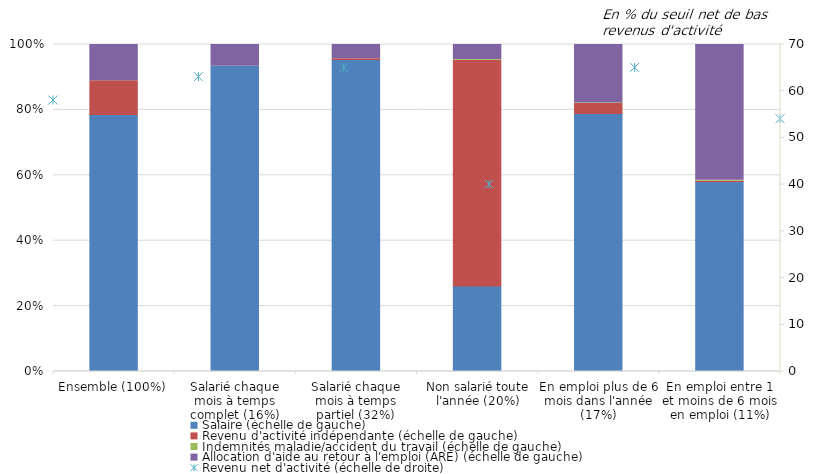
| Category | Salaire (échelle de gauche) | Revenu d'activité indépendante (échelle de gauche) | Indemnités maladie/accident du travail (échelle de gauche) | Allocation d'aide au retour à l'emploi (ARE) (échelle de gauche) |
|---|---|---|---|---|
| Ensemble (100%) | 504 | 66 | 0 | 71 |
| Salarié chaque mois à temps complet (16%) | 642 | 0 | 0 | 46 |
| Salarié chaque mois à temps partiel (32%) | 683 | 2 | 0 | 31 |
| Non salarié toute l'année (20%) | 114 | 301 | 1 | 20 |
| En emploi plus de 6 mois dans l'année (17%) | 564 | 22 | 1 | 128 |
| En emploi entre 1 et moins de 6 mois en emploi (11%) | 347 | 1 | 1 | 248 |